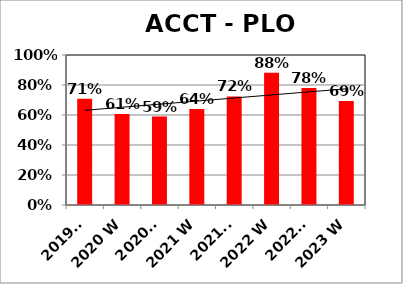
| Category | Series 0 |
|---|---|
| 2019 F | 0.708 |
| 2020 W | 0.607 |
| 2020 F | 0.59 |
| 2021 W | 0.64 |
| 2021 F | 0.724 |
| 2022 W | 0.881 |
| 2022 F | 0.78 |
| 2023 W | 0.694 |